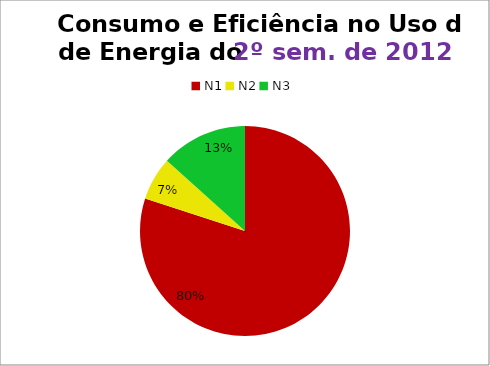
| Category | 2º/12 |
|---|---|
| N1 | 24 |
| N2 | 2 |
| N3 | 4 |